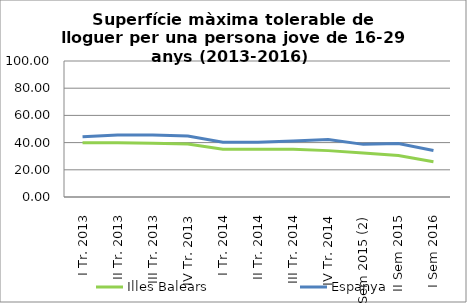
| Category | Illes Balears | Espanya |
|---|---|---|
| I Tr. 2013 | 39.8 | 44.3 |
| II Tr. 2013 | 39.8 | 45.5 |
| III Tr. 2013 | 39.6 | 45.6 |
| IV Tr. 2013 | 39 | 44.8 |
| I Tr. 2014 | 35.2 | 40.3 |
| II Tr. 2014 | 35.2 | 40.3 |
| III Tr. 2014 | 35.2 | 41.1 |
| IV Tr. 2014 | 34.1 | 42.3 |
| I Sem 2015 (2) | 32.4 | 38.7 |
| II Sem 2015 | 30.5 | 39.4 |
| I Sem 2016 | 25.9 | 34.2 |